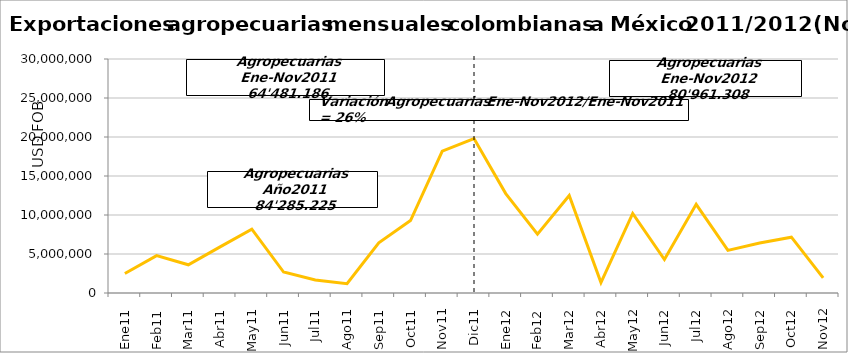
| Category | Series 0 |
|---|---|
| 0 | 2506386.55 |
| 1 | 4797648.03 |
| 2 | 3616695.24 |
| 3 | 5914840.63 |
| 4 | 8184530.86 |
| 5 | 2687420.35 |
| 6 | 1679717.83 |
| 7 | 1181992.86 |
| 8 | 6431294.52 |
| 9 | 9292497.76 |
| 10 | 18188161.36 |
| 11 | 19804038.7 |
| 12 | 12744286.34 |
| 13 | 7543804.51 |
| 14 | 12488268.29 |
| 15 | 1342905.14 |
| 16 | 10204002.29 |
| 17 | 4288740.49 |
| 18 | 11374994.41 |
| 19 | 5458909.12 |
| 20 | 6418184.22 |
| 21 | 7153808.48 |
| 22 | 1943405.04 |